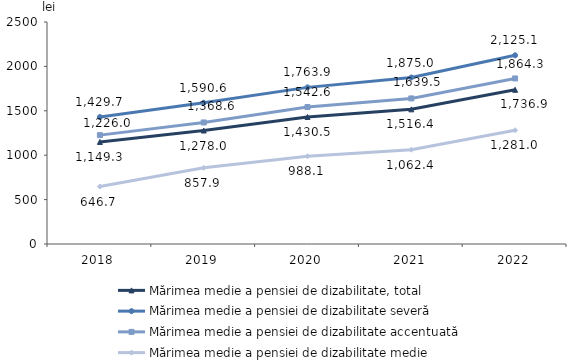
| Category | Mărimea medie a pensiei de dizabilitate, total | Mărimea medie a pensiei de dizabilitate severă | Mărimea medie a pensiei de dizabilitate accentuată | Mărimea medie a pensiei de dizabilitate medie |
|---|---|---|---|---|
| 2018.0 | 1149.3 | 1429.7 | 1226 | 646.7 |
| 2019.0 | 1278 | 1590.6 | 1368.6 | 857.9 |
| 2020.0 | 1430.5 | 1763.9 | 1542.6 | 988.1 |
| 2021.0 | 1516.4 | 1875 | 1639.5 | 1062.4 |
| 2022.0 | 1736.9 | 2125.1 | 1864.3 | 1281 |